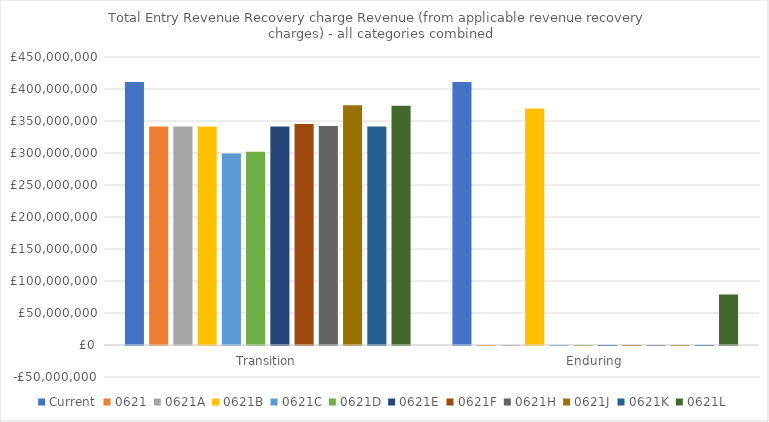
| Category | Current | 0621 | 0621A | 0621B | 0621C | 0621D | 0621E | 0621F | 0621H | 0621J | 0621K | 0621L |
|---|---|---|---|---|---|---|---|---|---|---|---|---|
| Transition | 410999201.483 | 341453258.427 | 341453258.427 | 341453258.427 | 299100992.342 | 301775491.884 | 341453258.427 | 345265594.639 | 342315387.314 | 374734426.95 | 341453258.427 | 373858794.327 |
| Enduring | 410999201.483 | 0 | 0 | 369614445.358 | 0 | 0 | 0 | 0 | 0 | 0 | 0 | 78734129.352 |